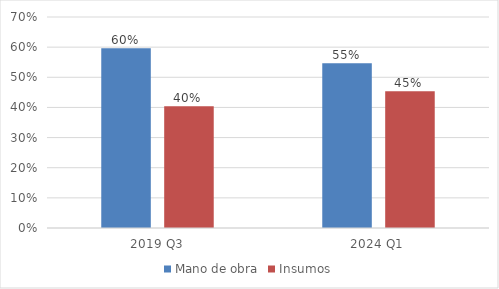
| Category | Mano de obra | Insumos |
|---|---|---|
| 2019 Q3 | 0.596 | 0.404 |
| 2024 Q1 | 0.546 | 0.454 |